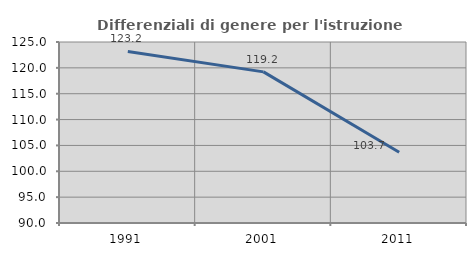
| Category | Differenziali di genere per l'istruzione superiore |
|---|---|
| 1991.0 | 123.183 |
| 2001.0 | 119.222 |
| 2011.0 | 103.684 |